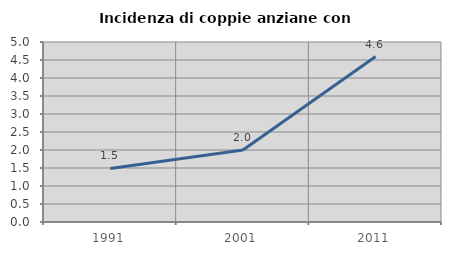
| Category | Incidenza di coppie anziane con figli |
|---|---|
| 1991.0 | 1.488 |
| 2001.0 | 1.998 |
| 2011.0 | 4.596 |